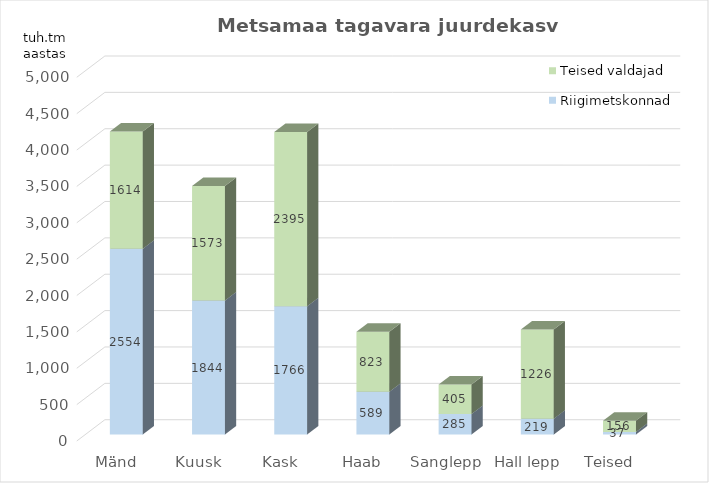
| Category | Riigimetskonnad | Teised valdajad |
|---|---|---|
| Mänd | 2554.155 | 1613.966 |
| Kuusk | 1844.361 | 1573.292 |
| Kask | 1765.684 | 2394.666 |
| Haab | 589.331 | 823.424 |
| Sanglepp | 284.619 | 404.704 |
| Hall lepp | 219.175 | 1225.853 |
| Teised | 36.509 | 155.655 |